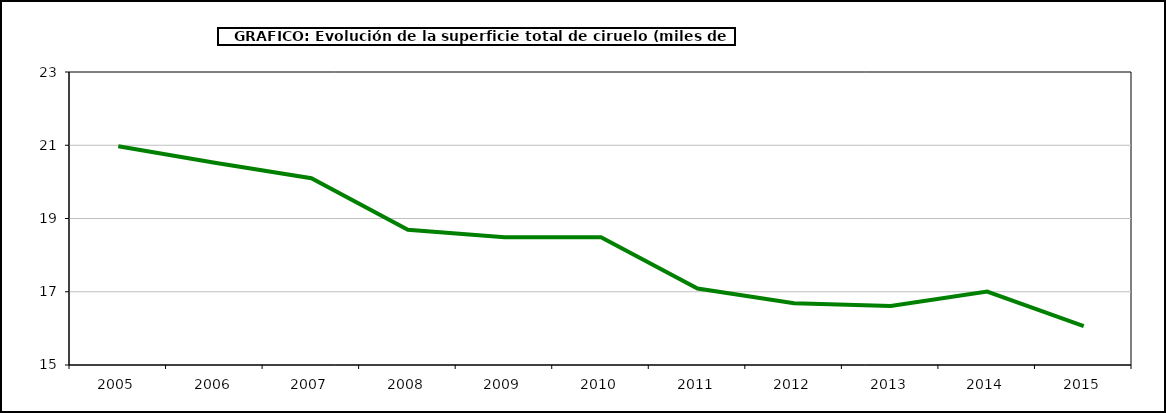
| Category | superficie ciruelo |
|---|---|
| 2005.0 | 20.971 |
| 2006.0 | 20.52 |
| 2007.0 | 20.101 |
| 2008.0 | 18.695 |
| 2009.0 | 18.489 |
| 2010.0 | 18.489 |
| 2011.0 | 17.086 |
| 2012.0 | 16.687 |
| 2013.0 | 16.614 |
| 2014.0 | 17.003 |
| 2015.0 | 16.064 |